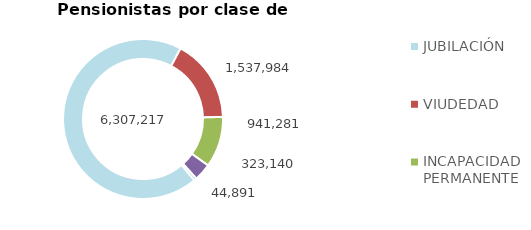
| Category | Series 0 |
|---|---|
| JUBILACIÓN | 6307217 |
| VIUDEDAD | 1537984 |
| INCAPACIDAD PERMANENTE | 941281 |
| ORFANDAD | 323140 |
| FAVOR DE FAMILIARES | 44891 |